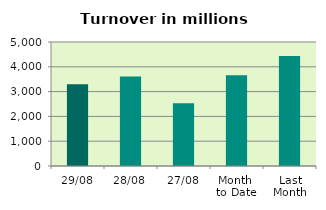
| Category | Series 0 |
|---|---|
| 29/08 | 3296.259 |
| 28/08 | 3606.624 |
| 27/08 | 2528.448 |
| Month 
to Date | 3658.495 |
| Last
Month | 4433.065 |